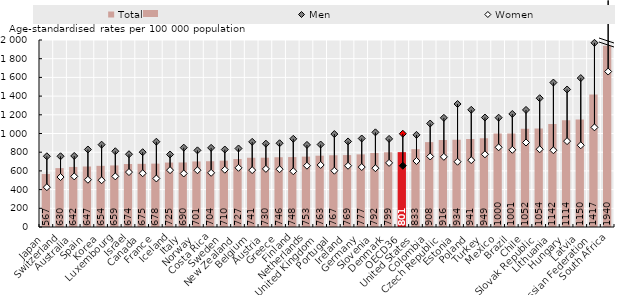
| Category | Total |
|---|---|
| Japan | 566.5 |
| Switzerland | 630 |
| Australia | 642.3 |
| Spain | 647.2 |
| Korea | 654.2 |
| Luxembourg | 658.6 |
| Israel | 674.1 |
| Canada | 675.4 |
| France | 677.8 |
| Iceland | 689.3 |
| Italy | 690.4 |
| Norway | 701.2 |
| Costa Rica | 703.6 |
| Sweden | 709.5 |
| New Zealand | 726.9 |
| Belgium | 740.7 |
| Austria | 741.4 |
| Greece | 746.2 |
| Finland | 747.9 |
| Netherlands | 752.5 |
| United Kingdom | 762.6 |
| Portugal | 767.3 |
| Ireland | 769.1 |
| Germany | 776.7 |
| Slovenia | 791.8 |
| Denmark | 799.1 |
| OECD36 | 800.65 |
| United States | 832.9 |
| Colombia | 907.9 |
| Czech Republic | 929.2 |
| Estonia | 933.7 |
| Poland | 941.3 |
| Turkey | 948.6 |
| Mexico | 999.5 |
| Brazil | 1000.9 |
| Chile | 1051.8 |
| Slovak Republic | 1054.2 |
| Lithuania | 1100.8 |
| Hungary | 1142.8 |
| Latvia | 1149.9 |
| Russian Federation | 1416.6 |
| South Africa | 1939.7 |